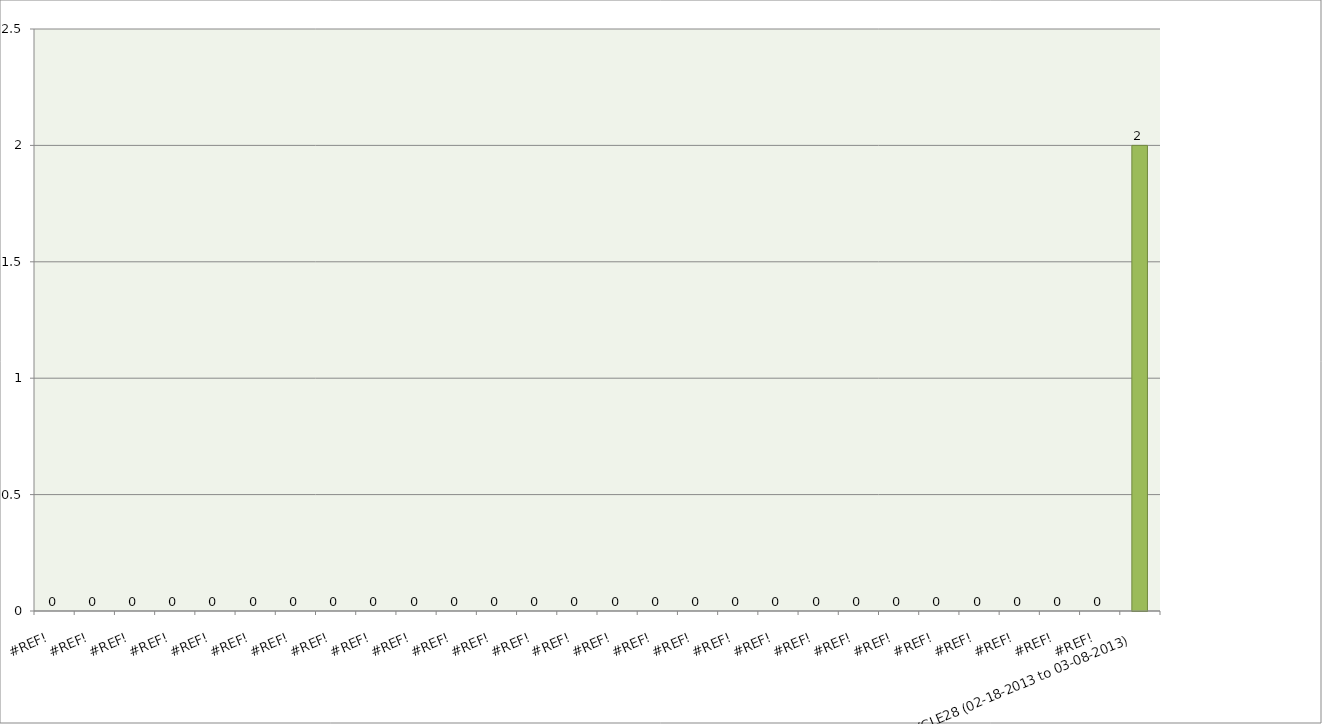
| Category | Series 0 |
|---|---|
| #REF! | 0 |
| #REF! | 0 |
| #REF! | 0 |
| #REF! | 0 |
| #REF! | 0 |
| #REF! | 0 |
| #REF! | 0 |
| #REF! | 0 |
| #REF! | 0 |
| #REF! | 0 |
| #REF! | 0 |
| #REF! | 0 |
| #REF! | 0 |
| #REF! | 0 |
| #REF! | 0 |
| #REF! | 0 |
| #REF! | 0 |
| #REF! | 0 |
| #REF! | 0 |
| #REF! | 0 |
| #REF! | 0 |
| #REF! | 0 |
| #REF! | 0 |
| #REF! | 0 |
| #REF! | 0 |
| #REF! | 0 |
| #REF! | 0 |
| CYCLE28 (02-18-2013 to 03-08-2013) | 2 |